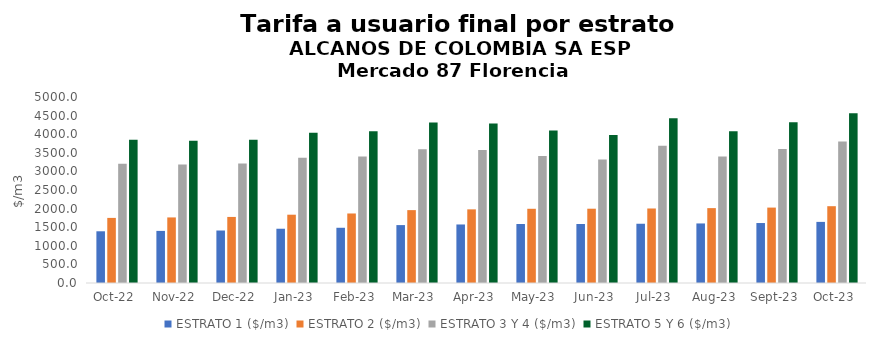
| Category | ESTRATO 1 ($/m3) | ESTRATO 2 ($/m3) | ESTRATO 3 Y 4 ($/m3) | ESTRATO 5 Y 6 ($/m3) |
|---|---|---|---|---|
| 2022-10-01 | 1390.28 | 1750.02 | 3208.12 | 3849.744 |
| 2022-11-01 | 1400.42 | 1762.52 | 3185.9 | 3823.08 |
| 2022-12-01 | 1410.99 | 1776 | 3209.93 | 3851.916 |
| 2023-01-01 | 1458.78 | 1836 | 3365.49 | 4038.588 |
| 2023-02-01 | 1484.64 | 1868.8 | 3398.26 | 4077.912 |
| 2023-03-01 | 1556.75 | 1959.18 | 3596.1 | 4315.32 |
| 2023-04-01 | 1573.28 | 1979.65 | 3575.22 | 4290.264 |
| 2023-05-01 | 1585.35 | 1995.07 | 3416.65 | 4099.98 |
| 2023-06-01 | 1586.86 | 1997.09 | 3316.57 | 3979.884 |
| 2023-07-01 | 1592.9 | 2003.01 | 3689.81 | 4427.772 |
| 2023-08-01 | 1600.9 | 2012.86 | 3401.48 | 4081.776 |
| 2023-09-01 | 1612.14 | 2027.25 | 3603.59 | 4324.308 |
| 2023-10-01 | 1642.77 | 2064.53 | 3805.44 | 4566.528 |